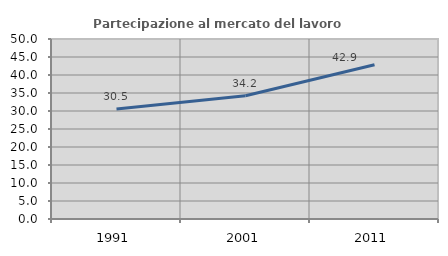
| Category | Partecipazione al mercato del lavoro  femminile |
|---|---|
| 1991.0 | 30.53 |
| 2001.0 | 34.223 |
| 2011.0 | 42.867 |